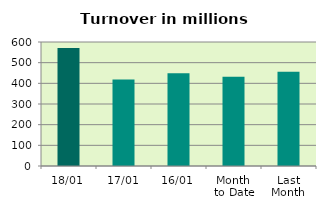
| Category | Series 0 |
|---|---|
| 18/01 | 570.535 |
| 17/01 | 419.01 |
| 16/01 | 448.725 |
| Month 
to Date | 431.444 |
| Last
Month | 455.699 |